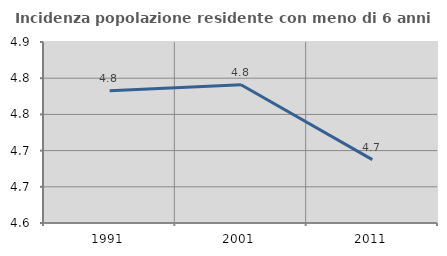
| Category | Incidenza popolazione residente con meno di 6 anni |
|---|---|
| 1991.0 | 4.783 |
| 2001.0 | 4.791 |
| 2011.0 | 4.688 |